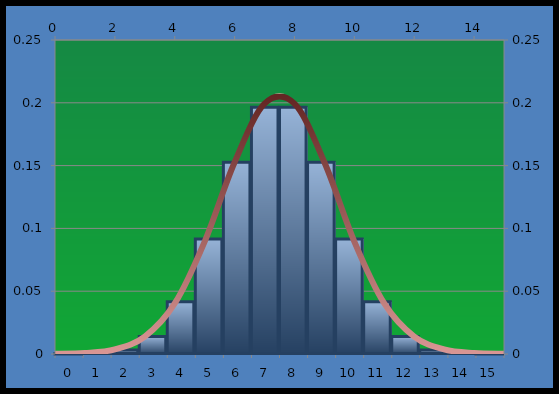
| Category | p(k) |
|---|---|
| 0.0 | 0 |
| 1.0 | 0 |
| 2.0 | 0.003 |
| 3.0 | 0.014 |
| 4.0 | 0.042 |
| 5.0 | 0.092 |
| 6.0 | 0.153 |
| 7.0 | 0.196 |
| 8.0 | 0.196 |
| 9.0 | 0.153 |
| 10.0 | 0.092 |
| 11.0 | 0.042 |
| 12.0 | 0.014 |
| 13.0 | 0.003 |
| 14.0 | 0 |
| 15.0 | 0 |